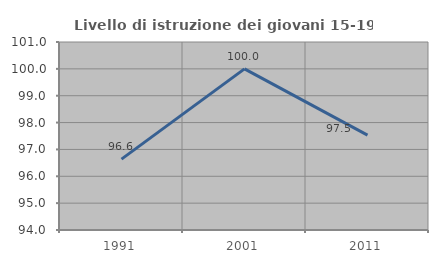
| Category | Livello di istruzione dei giovani 15-19 anni |
|---|---|
| 1991.0 | 96.639 |
| 2001.0 | 100 |
| 2011.0 | 97.531 |